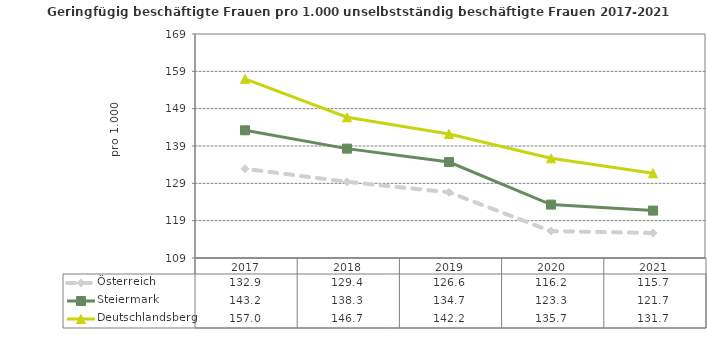
| Category | Österreich | Steiermark | Deutschlandsberg |
|---|---|---|---|
| 2021.0 | 115.7 | 121.7 | 131.7 |
| 2020.0 | 116.2 | 123.3 | 135.7 |
| 2019.0 | 126.6 | 134.7 | 142.2 |
| 2018.0 | 129.4 | 138.3 | 146.7 |
| 2017.0 | 132.9 | 143.2 | 157 |